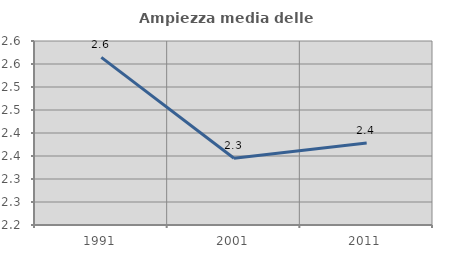
| Category | Ampiezza media delle famiglie |
|---|---|
| 1991.0 | 2.564 |
| 2001.0 | 2.345 |
| 2011.0 | 2.378 |